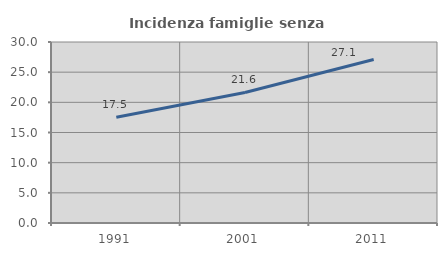
| Category | Incidenza famiglie senza nuclei |
|---|---|
| 1991.0 | 17.528 |
| 2001.0 | 21.63 |
| 2011.0 | 27.111 |